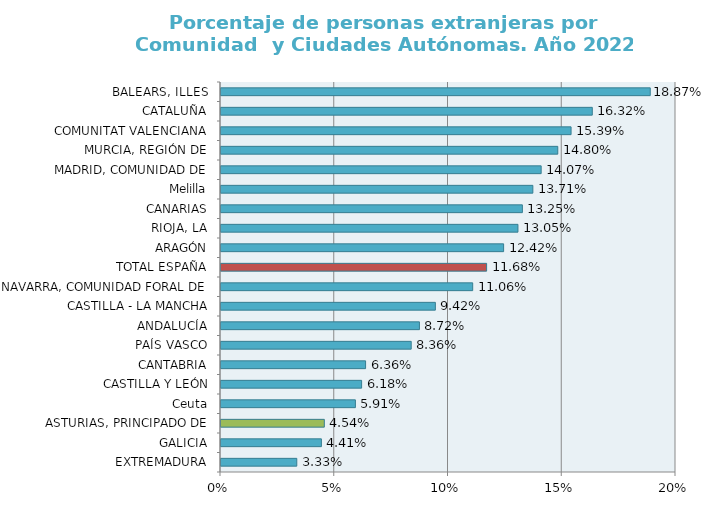
| Category | Series 0 |
|---|---|
| EXTREMADURA | 0.033 |
| GALICIA | 0.044 |
| ASTURIAS, PRINCIPADO DE | 0.045 |
| Ceuta | 0.059 |
| CASTILLA Y LEÓN | 0.062 |
| CANTABRIA | 0.064 |
| PAÍS VASCO | 0.084 |
| ANDALUCÍA | 0.087 |
| CASTILLA - LA MANCHA | 0.094 |
| NAVARRA, COMUNIDAD FORAL DE | 0.111 |
| TOTAL ESPAÑA | 0.117 |
| ARAGÓN | 0.124 |
| RIOJA, LA | 0.131 |
| CANARIAS | 0.132 |
| Melilla | 0.137 |
| MADRID, COMUNIDAD DE | 0.141 |
| MURCIA, REGIÓN DE | 0.148 |
| COMUNITAT VALENCIANA | 0.154 |
| CATALUÑA | 0.163 |
| BALEARS, ILLES | 0.189 |